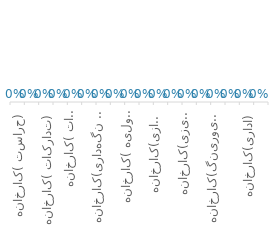
| Category | Series 0 |
|---|---|
| حراست (کارخانه) | 0 |
| آشپزخانه (کارخانه) | 0 |
| تدارکات (کارخانه) | 0 |
| انبار (کارخانه) | 0 |
| تاسیسات (کارخانه) | 0 |
| فنی تولید (کارخانه) | 0 |
| تعمیر و نگهداری(کارخانه) | 0 |
| QC و کنترل کیفیت (کارخانه) | 0 |
| حمل مواد اولیه (کارخانه) | 0 |
| حمل محصولات و سایر (کارخانه) | 0 |
| قالب سازی(کارخانه) | 0 |
| بتن سازی(کارخانه) | 0 |
| بتن ریزی(کارخانه) | 0 |
| آرماتور، میلگرد (کارخانه) | 0 |
| کیورینگ(کارخانه) | 0 |
| مدیریت(کارخانه) | 0 |
| اداری(کارخانه) | 0 |
| توزیع و فروش | 0 |